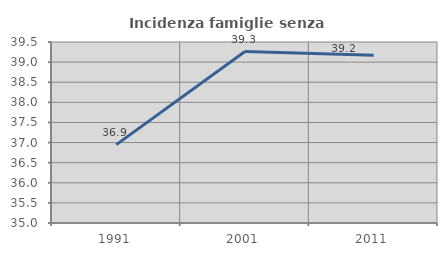
| Category | Incidenza famiglie senza nuclei |
|---|---|
| 1991.0 | 36.949 |
| 2001.0 | 39.262 |
| 2011.0 | 39.172 |